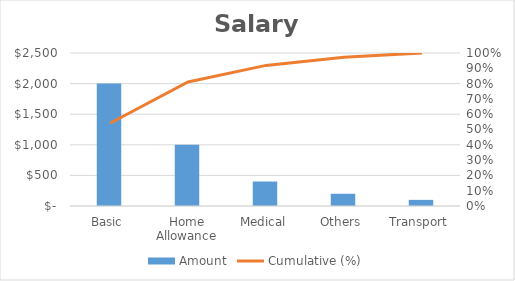
| Category | Amount |
|---|---|
| Basic | 2000 |
| Home Allowance | 1000 |
| Medical | 400 |
| Others | 200 |
| Transport | 100 |